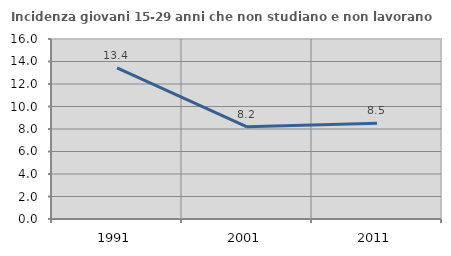
| Category | Incidenza giovani 15-29 anni che non studiano e non lavorano  |
|---|---|
| 1991.0 | 13.433 |
| 2001.0 | 8.197 |
| 2011.0 | 8.511 |